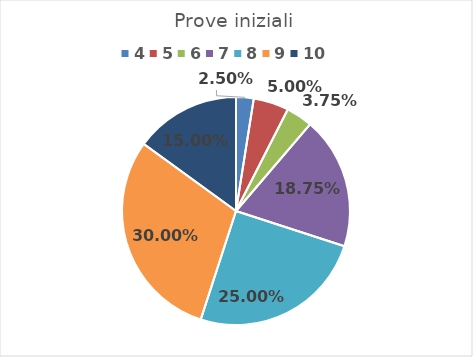
| Category | Series 0 |
|---|---|
| 4.0 | 0.025 |
| 5.0 | 0.05 |
| 6.0 | 0.038 |
| 7.0 | 0.188 |
| 8.0 | 0.25 |
| 9.0 | 0.3 |
| 10.0 | 0.15 |